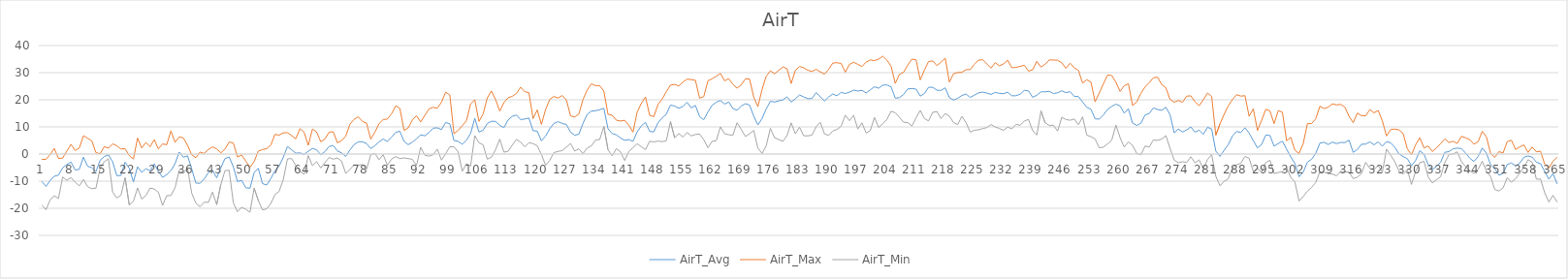
| Category | AirT_Avg | AirT_Max | AirT_Min |
|---|---|---|---|
| 0 | -10.11 | -1.98 | -18.76 |
| 1 | -11.94 | -1.96 | -20.53 |
| 2 | -9.76 | -0.17 | -16.85 |
| 3 | -8.19 | 2.08 | -15.38 |
| 4 | -7.78 | -1.69 | -16.41 |
| 5 | -5.09 | -1.45 | -8.46 |
| 6 | -3.87 | 1.04 | -9.71 |
| 7 | -2.95 | 3.58 | -8.69 |
| 8 | -5.89 | 1.31 | -10.38 |
| 9 | -5.63 | 2.22 | -11.74 |
| 10 | -1.15 | 6.73 | -9.36 |
| 11 | -4.53 | 5.81 | -12.05 |
| 12 | -5.03 | 4.86 | -12.77 |
| 13 | -6.48 | 0.49 | -12.59 |
| 14 | -2.28 | 0.14 | -5.24 |
| 15 | -0.92 | 2.69 | -2.84 |
| 16 | -0.35 | 2.13 | -1.76 |
| 17 | -2.81 | 3.76 | -14 |
| 18 | -7.98 | 3.07 | -16.18 |
| 19 | -7.88 | 1.86 | -15.22 |
| 20 | -3.02 | 1.98 | -8.76 |
| 21 | -5.23 | -0.6 | -18.77 |
| 22 | -10.27 | -1.81 | -17.4 |
| 23 | -4.7 | 5.88 | -12.5 |
| 24 | -6.77 | 2.22 | -16.59 |
| 25 | -5.41 | 4.28 | -15.26 |
| 26 | -6.19 | 2.68 | -12.53 |
| 27 | -3.62 | 5.28 | -12.9 |
| 28 | -6.36 | 1.91 | -14.1 |
| 29 | -8.61 | 3.73 | -18.97 |
| 30 | -7.6 | 3.43 | -15.35 |
| 31 | -6.14 | 8.49 | -15.29 |
| 32 | -3.55 | 4.32 | -12.46 |
| 33 | 0.73 | 6.32 | -6.04 |
| 34 | -1.17 | 5.93 | -7.12 |
| 35 | -0.65 | 3.21 | -5.16 |
| 36 | -5.45 | -0.29 | -14.4 |
| 37 | -10.7 | -1.36 | -18.12 |
| 38 | -10.79 | 0.73 | -19.44 |
| 39 | -9.18 | 0.22 | -17.74 |
| 40 | -6.86 | 1.67 | -17.84 |
| 41 | -5.94 | 2.64 | -14.03 |
| 42 | -8.76 | 1.91 | -18.7 |
| 43 | -5.07 | 0.42 | -11.2 |
| 44 | -1.65 | 1.86 | -6.11 |
| 45 | -1.12 | 4.44 | -5.98 |
| 46 | -4.71 | 4.07 | -17.99 |
| 47 | -10.15 | -1.13 | -21.25 |
| 48 | -9.7 | -0.33 | -19.62 |
| 49 | -12.46 | -2.64 | -20.4 |
| 50 | -12.59 | -4.89 | -21.46 |
| 51 | -6.83 | -2.78 | -12.56 |
| 52 | -5.29 | 1.09 | -17.14 |
| 53 | -10.88 | 1.66 | -20.6 |
| 54 | -11.45 | 1.98 | -20.19 |
| 55 | -9.06 | 3.32 | -18.25 |
| 56 | -6.17 | 7.24 | -14.95 |
| 57 | -4.42 | 6.96 | -13.75 |
| 58 | -1.2 | 7.81 | -9.43 |
| 59 | 2.77 | 7.87 | -1.79 |
| 60 | 1.58 | 6.77 | -1.66 |
| 61 | 0.31 | 5.61 | -4.23 |
| 62 | 0.43 | 9.36 | -6.41 |
| 63 | -0.15 | 8.01 | -7.46 |
| 64 | 1.03 | 3.21 | -0.57 |
| 65 | 2.08 | 9.22 | -4.27 |
| 66 | 1.55 | 8.13 | -2.81 |
| 67 | -0.23 | 4.53 | -5.12 |
| 68 | 0.89 | 5.51 | -3.18 |
| 69 | 2.78 | 8.06 | -1.28 |
| 70 | 3.13 | 8.21 | -1.89 |
| 71 | 1.15 | 4.16 | -1.45 |
| 72 | 0.42 | 4.89 | -2.6 |
| 73 | -0.88 | 6.61 | -7.15 |
| 74 | 1.47 | 10.96 | -5.72 |
| 75 | 3.46 | 12.79 | -4.02 |
| 76 | 4.48 | 13.71 | -4.09 |
| 77 | 4.53 | 12.04 | -3.86 |
| 78 | 3.87 | 11.4 | -5.62 |
| 79 | 2 | 5.49 | -0.29 |
| 80 | 3.06 | 8.02 | 0.25 |
| 81 | 4.48 | 11.21 | -2.09 |
| 82 | 5.54 | 12.69 | -0.26 |
| 83 | 4.6 | 12.89 | -4.13 |
| 84 | 6.24 | 14.83 | -1.88 |
| 85 | 7.98 | 17.79 | -0.97 |
| 86 | 8.43 | 16.83 | -1.69 |
| 87 | 4.66 | 8.71 | -1.42 |
| 88 | 3.45 | 9.64 | -1.68 |
| 89 | 4.35 | 12.52 | -1.95 |
| 90 | 5.61 | 14.11 | -4.26 |
| 91 | 7.06 | 11.81 | 2.46 |
| 92 | 6.72 | 14.26 | -0.43 |
| 93 | 7.92 | 16.64 | -0.77 |
| 94 | 9.54 | 17.21 | -0.26 |
| 95 | 9.66 | 16.9 | 1.81 |
| 96 | 9.01 | 19.12 | -2.23 |
| 97 | 11.62 | 22.82 | 0.12 |
| 98 | 11.15 | 21.78 | 2.67 |
| 99 | 5 | 7.48 | 2.7 |
| 100 | 4.65 | 8.77 | 0.76 |
| 101 | 3.59 | 10.44 | -6.31 |
| 102 | 5.15 | 12.32 | -3.56 |
| 103 | 7.59 | 18.52 | -4.43 |
| 104 | 13.18 | 19.99 | 6.79 |
| 105 | 8.11 | 12.03 | 4.16 |
| 106 | 8.76 | 14.77 | 3.38 |
| 107 | 11.23 | 20.7 | -1.89 |
| 108 | 12.09 | 23.23 | -1.18 |
| 109 | 12 | 20.06 | 1.68 |
| 110 | 10.56 | 15.82 | 5.51 |
| 111 | 9.73 | 18.97 | 0.69 |
| 112 | 12.55 | 20.78 | 1.03 |
| 113 | 13.9 | 21.26 | 3.27 |
| 114 | 14.38 | 22.34 | 5.4 |
| 115 | 12.69 | 24.63 | 4.43 |
| 116 | 12.91 | 22.96 | 2.67 |
| 117 | 13.26 | 22.61 | 4.16 |
| 118 | 8.59 | 13.05 | 3.84 |
| 119 | 8.45 | 16.26 | 3.04 |
| 120 | 4.86 | 10.92 | -0.19 |
| 121 | 6.6 | 16.38 | -4.09 |
| 122 | 9.33 | 20.12 | -2.36 |
| 123 | 11.29 | 21.24 | 0.52 |
| 124 | 11.94 | 20.67 | 0.97 |
| 125 | 11.25 | 21.57 | 1.27 |
| 126 | 10.9 | 19.96 | 2.52 |
| 127 | 8.05 | 14.08 | 3.88 |
| 128 | 6.93 | 13.64 | 1.11 |
| 129 | 7.32 | 14.79 | 1.92 |
| 130 | 11.36 | 20.14 | 0.18 |
| 131 | 14.64 | 23.61 | 2.22 |
| 132 | 15.82 | 25.86 | 3 |
| 133 | 15.97 | 25.24 | 5.18 |
| 134 | 16.33 | 25.21 | 5.34 |
| 135 | 16.87 | 23.18 | 10.2 |
| 136 | 9.33 | 14.66 | 1.6 |
| 137 | 7.53 | 14.32 | -0.7 |
| 138 | 7.09 | 12.47 | 1.98 |
| 139 | 5.92 | 12.16 | 0.8 |
| 140 | 5.06 | 12.45 | -2.4 |
| 141 | 5.3 | 10.64 | 0.97 |
| 142 | 4.67 | 8.09 | 2.35 |
| 143 | 8.13 | 15.41 | 3.79 |
| 144 | 10.39 | 18.68 | 2.67 |
| 145 | 11.69 | 21.04 | 1.65 |
| 146 | 8.37 | 14.32 | 4.72 |
| 147 | 8.16 | 13.78 | 4.46 |
| 148 | 11.52 | 18.23 | 4.77 |
| 149 | 13.32 | 20.26 | 4.56 |
| 150 | 14.66 | 22.97 | 4.84 |
| 151 | 18.04 | 25.39 | 11.96 |
| 152 | 17.7 | 25.68 | 5.98 |
| 153 | 16.87 | 25.1 | 7.54 |
| 154 | 17.52 | 26.51 | 6.29 |
| 155 | 19.06 | 27.61 | 7.92 |
| 156 | 16.99 | 27.44 | 6.69 |
| 157 | 17.92 | 27.17 | 7.21 |
| 158 | 13.81 | 20.59 | 7.34 |
| 159 | 12.65 | 21.15 | 5.3 |
| 160 | 15.5 | 27 | 2.34 |
| 161 | 17.97 | 27.72 | 4.66 |
| 162 | 19.09 | 28.67 | 4.93 |
| 163 | 19.76 | 29.72 | 10.02 |
| 164 | 18.41 | 27 | 7.48 |
| 165 | 19.18 | 27.78 | 7.11 |
| 166 | 16.78 | 25.64 | 6.93 |
| 167 | 16.14 | 24.29 | 11.55 |
| 168 | 17.73 | 25.5 | 9.07 |
| 169 | 18.54 | 27.72 | 6.49 |
| 170 | 18.04 | 27.67 | 7.44 |
| 171 | 14 | 21.02 | 8.7 |
| 172 | 10.73 | 17.46 | 2.18 |
| 173 | 13.11 | 23.77 | 0.22 |
| 174 | 16.6 | 28.67 | 3.03 |
| 175 | 19.44 | 30.67 | 9.46 |
| 176 | 19.15 | 29.56 | 6.02 |
| 177 | 19.6 | 30.83 | 5.34 |
| 178 | 19.95 | 32.11 | 4.67 |
| 179 | 21.09 | 31.44 | 6.77 |
| 180 | 19.16 | 25.99 | 11.5 |
| 181 | 20.37 | 30.89 | 7.44 |
| 182 | 21.78 | 32.28 | 9.88 |
| 183 | 21.05 | 31.78 | 6.73 |
| 184 | 20.41 | 30.89 | 6.69 |
| 185 | 20.46 | 30.44 | 7 |
| 186 | 22.65 | 31.22 | 10.1 |
| 187 | 21.11 | 30.28 | 11.68 |
| 188 | 19.53 | 29.44 | 7.41 |
| 189 | 21.05 | 31.22 | 6.87 |
| 190 | 22.14 | 33.56 | 8.47 |
| 191 | 21.47 | 33.67 | 9.08 |
| 192 | 22.74 | 33.39 | 10.26 |
| 193 | 22.31 | 30.17 | 14.32 |
| 194 | 22.8 | 33.06 | 12.28 |
| 195 | 23.56 | 33.83 | 14.26 |
| 196 | 23.23 | 33.06 | 9.23 |
| 197 | 23.51 | 32.28 | 11.51 |
| 198 | 22.51 | 33.89 | 7.75 |
| 199 | 23.66 | 34.67 | 8.59 |
| 200 | 24.79 | 34.44 | 13.51 |
| 201 | 24.26 | 35 | 9.81 |
| 202 | 25.39 | 36.06 | 11.19 |
| 203 | 25.48 | 34.61 | 12.76 |
| 204 | 24.74 | 32.39 | 15.79 |
| 205 | 20.59 | 26.02 | 15.21 |
| 206 | 20.79 | 29.39 | 13.58 |
| 207 | 21.96 | 30.11 | 11.72 |
| 208 | 24 | 32.78 | 11.6 |
| 209 | 24.14 | 35 | 10.32 |
| 210 | 23.94 | 34.72 | 13.37 |
| 211 | 21.36 | 27.33 | 16.09 |
| 212 | 22.29 | 30.94 | 13.07 |
| 213 | 24.6 | 34.11 | 12.19 |
| 214 | 24.6 | 34.33 | 15.37 |
| 215 | 23.53 | 32.61 | 15.68 |
| 216 | 23.45 | 33.89 | 13.1 |
| 217 | 24.42 | 35.33 | 14.93 |
| 218 | 20.79 | 26.53 | 13.95 |
| 219 | 19.93 | 29.61 | 11.58 |
| 220 | 20.55 | 30.06 | 10.84 |
| 221 | 21.59 | 30.11 | 13.89 |
| 222 | 22.13 | 31.11 | 11.57 |
| 223 | 20.86 | 31.11 | 8.06 |
| 224 | 21.71 | 33.06 | 8.81 |
| 225 | 22.56 | 34.61 | 8.91 |
| 226 | 22.82 | 34.78 | 9.38 |
| 227 | 22.48 | 33.22 | 9.75 |
| 228 | 21.98 | 31.67 | 10.87 |
| 229 | 22.72 | 33.67 | 9.99 |
| 230 | 22.38 | 32.56 | 9.44 |
| 231 | 22.23 | 33.17 | 8.71 |
| 232 | 22.81 | 34.61 | 9.96 |
| 233 | 21.48 | 31.83 | 9.28 |
| 234 | 21.5 | 31.94 | 10.94 |
| 235 | 22.07 | 32.33 | 10.59 |
| 236 | 23.47 | 32.72 | 12.16 |
| 237 | 23.29 | 30.56 | 12.76 |
| 238 | 20.91 | 31.06 | 8.64 |
| 239 | 21.67 | 34.17 | 6.98 |
| 240 | 22.92 | 32.06 | 15.87 |
| 241 | 22.95 | 33.11 | 11.48 |
| 242 | 23.11 | 34.67 | 10.53 |
| 243 | 22.3 | 34.67 | 10.63 |
| 244 | 22.58 | 34.56 | 8.43 |
| 245 | 23.32 | 33.61 | 13.55 |
| 246 | 22.62 | 31.61 | 12.73 |
| 247 | 22.97 | 33.5 | 12.45 |
| 248 | 21.25 | 31.78 | 12.9 |
| 249 | 21.18 | 30.83 | 10.81 |
| 250 | 19.2 | 26.14 | 13.71 |
| 251 | 17.22 | 27.39 | 6.97 |
| 252 | 16.51 | 26.57 | 6.4 |
| 253 | 12.99 | 19.24 | 5.56 |
| 254 | 12.86 | 22.52 | 2.33 |
| 255 | 14.43 | 25.89 | 2.53 |
| 256 | 16.45 | 29.17 | 3.75 |
| 257 | 17.58 | 28.94 | 5.11 |
| 258 | 18.36 | 26.49 | 10.67 |
| 259 | 17.74 | 23.06 | 6.08 |
| 260 | 15.06 | 25.2 | 2.57 |
| 261 | 16.67 | 25.92 | 4.46 |
| 262 | 11.42 | 17.91 | 3.19 |
| 263 | 10.53 | 19.22 | 0.25 |
| 264 | 11.35 | 22.36 | -0.29 |
| 265 | 14.42 | 24.77 | 2.94 |
| 266 | 14.92 | 26.31 | 2.6 |
| 267 | 17 | 28.11 | 5.18 |
| 268 | 16.41 | 28.33 | 5.04 |
| 269 | 16.09 | 25.63 | 5.51 |
| 270 | 17.23 | 24.46 | 6.77 |
| 271 | 14.51 | 20.13 | 2.15 |
| 272 | 7.85 | 19.1 | -2.22 |
| 273 | 9.22 | 19.76 | -3.21 |
| 274 | 8.12 | 19.06 | -2.84 |
| 275 | 8.9 | 21.33 | -3.11 |
| 276 | 9.96 | 21.46 | -1.01 |
| 277 | 8.09 | 19.26 | -3.24 |
| 278 | 8.81 | 17.83 | -2.17 |
| 279 | 7.24 | 20.02 | -5.52 |
| 280 | 9.85 | 22.49 | -2.02 |
| 281 | 9.22 | 21.21 | -0.19 |
| 282 | 1.07 | 6.97 | -8.21 |
| 283 | -0.87 | 11.09 | -11.71 |
| 284 | 1.41 | 14.66 | -10.04 |
| 285 | 3.49 | 17.77 | -9.09 |
| 286 | 6.66 | 20.11 | -5.14 |
| 287 | 8.31 | 21.88 | -3.96 |
| 288 | 7.94 | 21.36 | -3.45 |
| 289 | 9.68 | 21.51 | -0.87 |
| 290 | 7.7 | 13.92 | -1.56 |
| 291 | 4.92 | 16.68 | -6.44 |
| 292 | 2.27 | 8.7 | -5.37 |
| 293 | 3.51 | 12.41 | -6.73 |
| 294 | 7.01 | 16.48 | -3.13 |
| 295 | 6.84 | 15.92 | -2.29 |
| 296 | 2.89 | 11.2 | -7.19 |
| 297 | 3.9 | 16.02 | -6.83 |
| 298 | 4.73 | 15.42 | -6.44 |
| 299 | 1.82 | 4.85 | -4.98 |
| 300 | -1.06 | 6.17 | -8.62 |
| 301 | -3.44 | 1.38 | -10.33 |
| 302 | -8.37 | 0.18 | -17.34 |
| 303 | -6.69 | 3.88 | -15.68 |
| 304 | -2.99 | 11.2 | -13.69 |
| 305 | -1.96 | 11.21 | -12.32 |
| 306 | 0.26 | 13 | -10.48 |
| 307 | 4.04 | 17.62 | -6.56 |
| 308 | 4.34 | 16.76 | -6.67 |
| 309 | 3.51 | 17.3 | -7.27 |
| 310 | 4.39 | 18.47 | -7.36 |
| 311 | 3.82 | 18.11 | -8.04 |
| 312 | 4.28 | 18.31 | -6.31 |
| 313 | 4.21 | 17.29 | -6.63 |
| 314 | 5.11 | 13.93 | -6.64 |
| 315 | 0.61 | 11.53 | -9.08 |
| 316 | 1.71 | 15.09 | -8.53 |
| 317 | 3.61 | 14.14 | -7.16 |
| 318 | 3.66 | 14.08 | -3.05 |
| 319 | 4.48 | 16.38 | -5.33 |
| 320 | 3.4 | 15.19 | -5.72 |
| 321 | 4.47 | 16.06 | -4.23 |
| 322 | 2.88 | 12.23 | -6.73 |
| 323 | 4.56 | 6.68 | 1.82 |
| 324 | 4.14 | 9.01 | -0.44 |
| 325 | 2.45 | 9.21 | -2.86 |
| 326 | 0.02 | 8.9 | -6.24 |
| 327 | -0.92 | 7.54 | -7.41 |
| 328 | -1.7 | 1.94 | -5.72 |
| 329 | -4.33 | -0.28 | -11.21 |
| 330 | -2.35 | 3.42 | -6.39 |
| 331 | 1.2 | 6.01 | -3.21 |
| 332 | -0.04 | 2.24 | -2.66 |
| 333 | -3.85 | 2.96 | -8.39 |
| 334 | -5.67 | 0.91 | -10.68 |
| 335 | -4.61 | 2.21 | -9.5 |
| 336 | -3.02 | 3.83 | -8.33 |
| 337 | 0.64 | 5.58 | -3.23 |
| 338 | 0.89 | 4.24 | -0.21 |
| 339 | 1.96 | 4.71 | 0.02 |
| 340 | 2.18 | 3.91 | 0.8 |
| 341 | 2.03 | 6.54 | -2.78 |
| 342 | 0.34 | 5.97 | -4.62 |
| 343 | -1.54 | 5.33 | -6.21 |
| 344 | -2.74 | 3.64 | -7.09 |
| 345 | -0.9 | 4.53 | -5.66 |
| 346 | 2.21 | 8.36 | -2.66 |
| 347 | 0.34 | 6.32 | -6.28 |
| 348 | -3.84 | 0.29 | -8.33 |
| 349 | -5.38 | -1.24 | -13.04 |
| 350 | -7.78 | 0.89 | -13.65 |
| 351 | -7.17 | 0.41 | -12.48 |
| 352 | -3.87 | 4.6 | -8.75 |
| 353 | -3.29 | 5.08 | -10.4 |
| 354 | -4.36 | 1.72 | -9.11 |
| 355 | -3.41 | 2.62 | -7.09 |
| 356 | -1.19 | 3.38 | -4.9 |
| 357 | -0.72 | 0.59 | -2.1 |
| 358 | -1.13 | 2.59 | -3.04 |
| 359 | -2.98 | 0.82 | -9.26 |
| 360 | -3.55 | 1.06 | -9.24 |
| 361 | -6.4 | -3.75 | -14.3 |
| 362 | -9.28 | -5.21 | -17.69 |
| 363 | -7.26 | -2.69 | -15.23 |
| 364 | -11.03 | -1.17 | -17.77 |